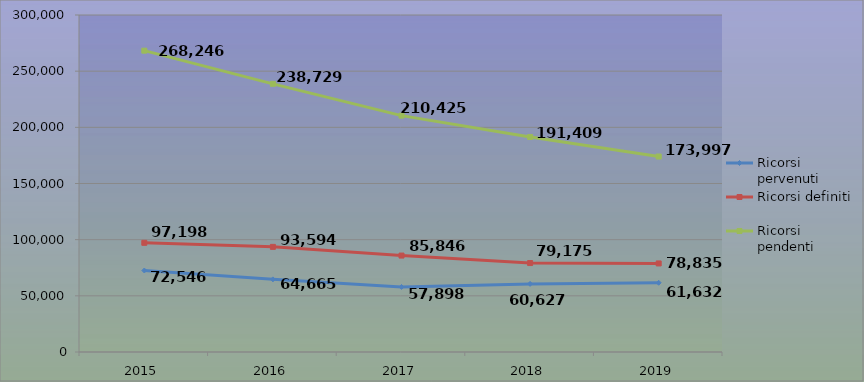
| Category | Ricorsi pervenuti | Ricorsi definiti | Ricorsi pendenti |
|---|---|---|---|
| 2015.0 | 72546 | 97198 | 268246 |
| 2016.0 | 64665 | 93594 | 238729 |
| 2017.0 | 57898 | 85846 | 210425 |
| 2018.0 | 60627 | 79175 | 191409 |
| 2019.0 | 61632 | 78835 | 173997 |